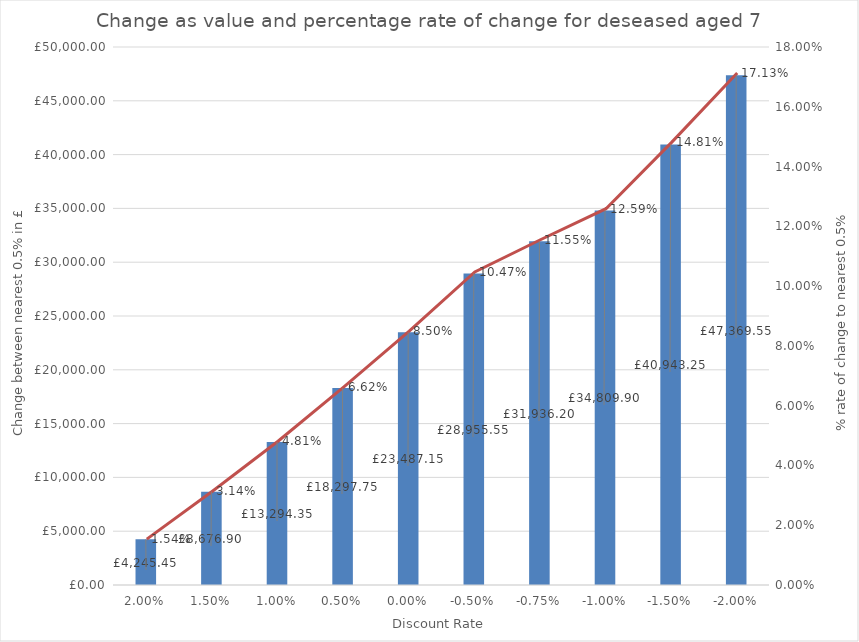
| Category | Value change |
|---|---|
| 0.02 | 4245.45 |
| 0.015 | 8676.9 |
| 0.01 | 13294.35 |
| 0.005 | 18297.75 |
| 0.0 | 23487.15 |
| -0.005 | 28955.55 |
| -0.0075 | 31936.2 |
| -0.01 | 34809.9 |
| -0.015 | 40943.25 |
| -0.02 | 47369.55 |